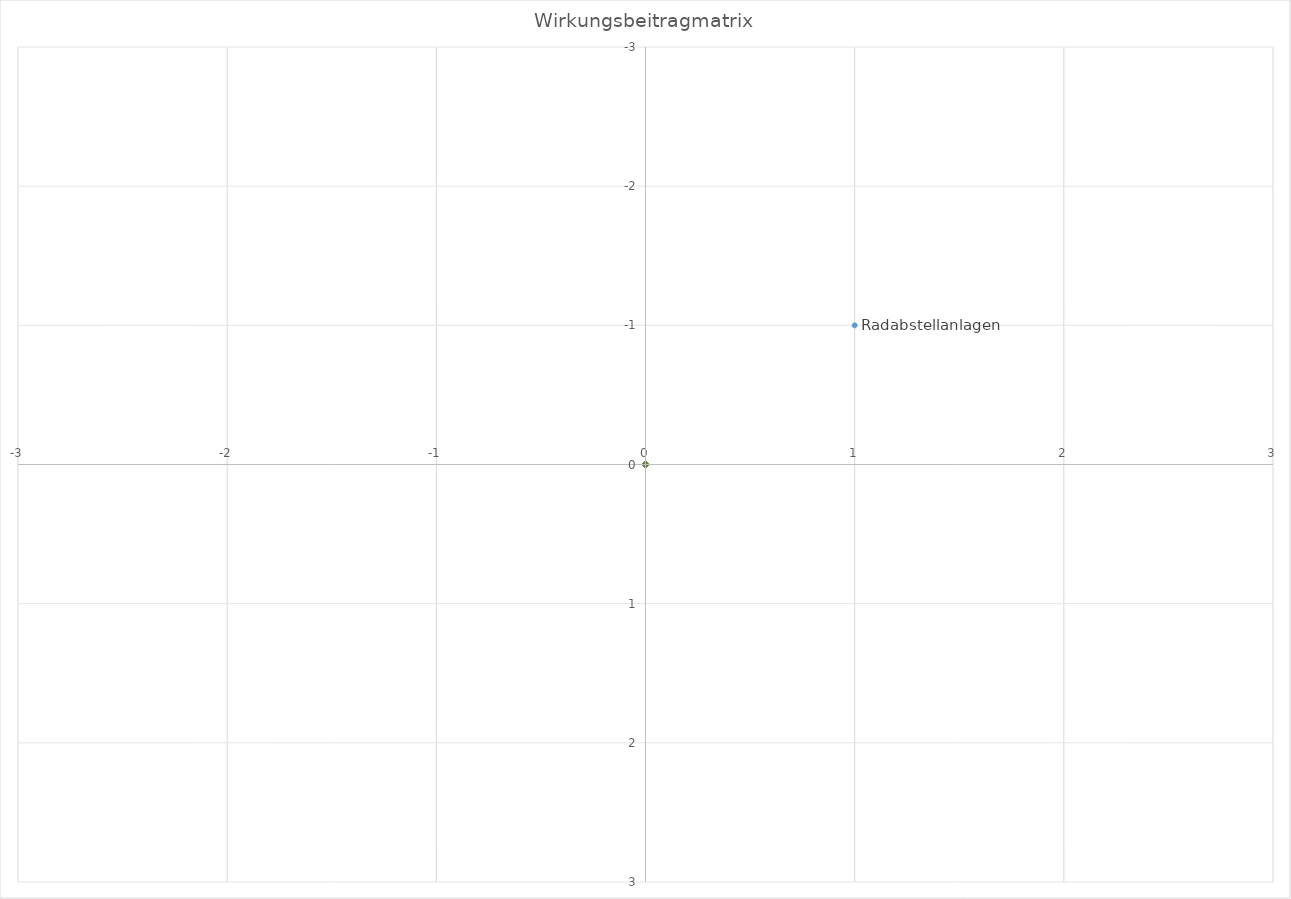
| Category | Series 0 |
|---|---|
| 1.0 | -1 |
| 0.0 | 0 |
| 0.0 | 0 |
| 0.0 | 0 |
| 0.0 | 0 |
| 0.0 | 0 |
| 0.0 | 0 |
| 0.0 | 0 |
| 0.0 | 0 |
| 0.0 | 0 |
| 0.0 | 0 |
| 0.0 | 0 |
| 0.0 | 0 |
| 0.0 | 0 |
| 0.0 | 0 |
| 0.0 | 0 |
| 0.0 | 0 |
| 0.0 | 0 |
| 0.0 | 0 |
| 0.0 | 0 |
| 0.0 | 0 |
| 0.0 | 0 |
| 0.0 | 0 |
| 0.0 | 0 |
| 0.0 | 0 |
| 0.0 | 0 |
| 0.0 | 0 |
| 0.0 | 0 |
| 0.0 | 0 |
| 0.0 | 0 |
| 0.0 | 0 |
| 0.0 | 0 |
| 0.0 | 0 |
| 0.0 | 0 |
| 0.0 | 0 |
| 0.0 | 0 |
| 0.0 | 0 |
| 0.0 | 0 |
| 0.0 | 0 |
| 0.0 | 0 |
| 0.0 | 0 |
| 0.0 | 0 |
| 0.0 | 0 |
| 0.0 | 0 |
| 0.0 | 0 |
| 0.0 | 0 |
| 0.0 | 0 |
| 0.0 | 0 |
| 0.0 | 0 |
| 0.0 | 0 |
| 0.0 | 0 |
| 0.0 | 0 |
| 0.0 | 0 |
| 0.0 | 0 |
| 0.0 | 0 |
| 0.0 | 0 |
| 0.0 | 0 |
| 0.0 | 0 |
| 0.0 | 0 |
| 0.0 | 0 |
| 0.0 | 0 |
| 0.0 | 0 |
| 0.0 | 0 |
| 0.0 | 0 |
| 0.0 | 0 |
| 0.0 | 0 |
| 0.0 | 0 |
| 0.0 | 0 |
| 0.0 | 0 |
| 0.0 | 0 |
| 0.0 | 0 |
| 0.0 | 0 |
| 0.0 | 0 |
| 0.0 | 0 |
| 0.0 | 0 |
| 0.0 | 0 |
| 0.0 | 0 |
| 0.0 | 0 |
| 0.0 | 0 |
| 0.0 | 0 |
| 0.0 | 0 |
| 0.0 | 0 |
| 0.0 | 0 |
| 0.0 | 0 |
| 0.0 | 0 |
| 0.0 | 0 |
| 0.0 | 0 |
| 0.0 | 0 |
| 0.0 | 0 |
| 0.0 | 0 |
| 0.0 | 0 |
| 0.0 | 0 |
| 0.0 | 0 |
| 0.0 | 0 |
| 0.0 | 0 |
| 0.0 | 0 |
| 0.0 | 0 |
| 0.0 | 0 |
| 0.0 | 0 |
| 0.0 | 0 |
| 0.0 | 0 |
| 0.0 | 0 |
| 0.0 | 0 |
| 0.0 | 0 |
| 0.0 | 0 |
| 0.0 | 0 |
| 0.0 | 0 |
| 0.0 | 0 |
| 0.0 | 0 |
| 0.0 | 0 |
| 0.0 | 0 |
| 0.0 | 0 |
| 0.0 | 0 |
| 0.0 | 0 |
| 0.0 | 0 |
| 0.0 | 0 |
| 0.0 | 0 |
| 0.0 | 0 |
| 0.0 | 0 |
| 0.0 | 0 |
| 0.0 | 0 |
| 0.0 | 0 |
| 0.0 | 0 |
| 0.0 | 0 |
| 0.0 | 0 |
| 0.0 | 0 |
| 0.0 | 0 |
| 0.0 | 0 |
| 0.0 | 0 |
| 0.0 | 0 |
| 0.0 | 0 |
| 0.0 | 0 |
| 0.0 | 0 |
| 0.0 | 0 |
| 0.0 | 0 |
| 0.0 | 0 |
| 0.0 | 0 |
| 0.0 | 0 |
| 0.0 | 0 |
| 0.0 | 0 |
| 0.0 | 0 |
| 0.0 | 0 |
| 0.0 | 0 |
| 0.0 | 0 |
| 0.0 | 0 |
| 0.0 | 0 |
| 0.0 | 0 |
| 0.0 | 0 |
| 0.0 | 0 |
| 0.0 | 0 |
| 0.0 | 0 |
| 0.0 | 0 |
| 0.0 | 0 |
| 0.0 | 0 |
| 0.0 | 0 |
| 0.0 | 0 |
| 0.0 | 0 |
| 0.0 | 0 |
| 0.0 | 0 |
| 0.0 | 0 |
| 0.0 | 0 |
| 0.0 | 0 |
| 0.0 | 0 |
| 0.0 | 0 |
| 0.0 | 0 |
| 0.0 | 0 |
| 0.0 | 0 |
| 0.0 | 0 |
| 0.0 | 0 |
| 0.0 | 0 |
| 0.0 | 0 |
| 0.0 | 0 |
| 0.0 | 0 |
| 0.0 | 0 |
| 0.0 | 0 |
| 0.0 | 0 |
| 0.0 | 0 |
| 0.0 | 0 |
| 0.0 | 0 |
| 0.0 | 0 |
| 0.0 | 0 |
| 0.0 | 0 |
| 0.0 | 0 |
| 0.0 | 0 |
| 0.0 | 0 |
| 0.0 | 0 |